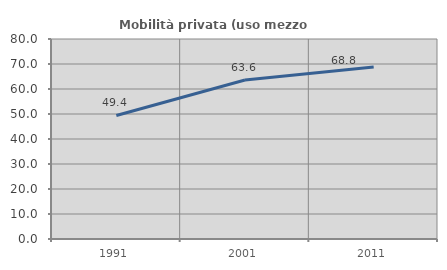
| Category | Mobilità privata (uso mezzo privato) |
|---|---|
| 1991.0 | 49.425 |
| 2001.0 | 63.627 |
| 2011.0 | 68.771 |